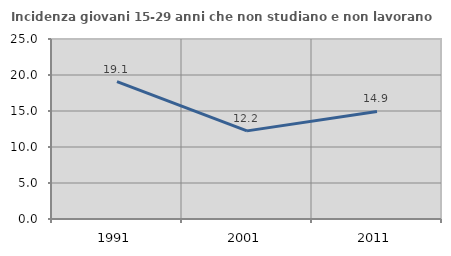
| Category | Incidenza giovani 15-29 anni che non studiano e non lavorano  |
|---|---|
| 1991.0 | 19.075 |
| 2001.0 | 12.237 |
| 2011.0 | 14.941 |